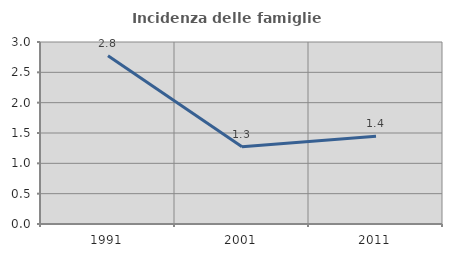
| Category | Incidenza delle famiglie numerose |
|---|---|
| 1991.0 | 2.774 |
| 2001.0 | 1.275 |
| 2011.0 | 1.446 |